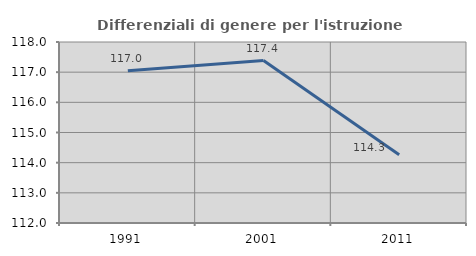
| Category | Differenziali di genere per l'istruzione superiore |
|---|---|
| 1991.0 | 117.044 |
| 2001.0 | 117.386 |
| 2011.0 | 114.264 |